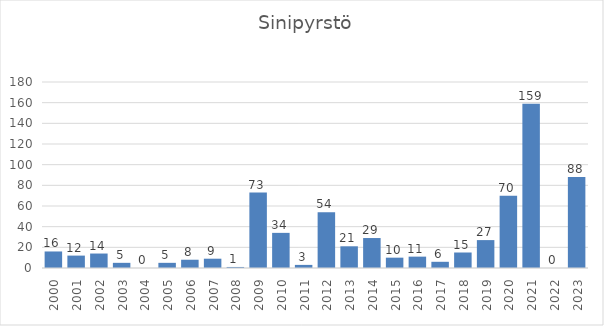
| Category | Series 0 |
|---|---|
| 2000.0 | 16 |
| 2001.0 | 12 |
| 2002.0 | 14 |
| 2003.0 | 5 |
| 2004.0 | 0 |
| 2005.0 | 5 |
| 2006.0 | 8 |
| 2007.0 | 9 |
| 2008.0 | 1 |
| 2009.0 | 73 |
| 2010.0 | 34 |
| 2011.0 | 3 |
| 2012.0 | 54 |
| 2013.0 | 21 |
| 2014.0 | 29 |
| 2015.0 | 10 |
| 2016.0 | 11 |
| 2017.0 | 6 |
| 2018.0 | 15 |
| 2019.0 | 27 |
| 2020.0 | 70 |
| 2021.0 | 159 |
| 2022.0 | 0 |
| 2023.0 | 88 |